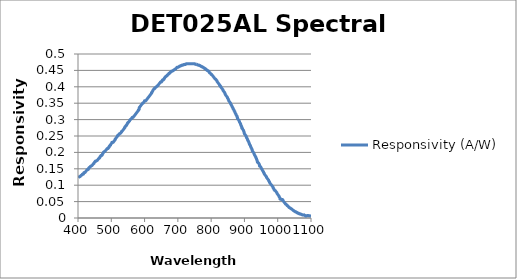
| Category | Responsivity (A/W) |
|---|---|
| 400.30475 | 0.123 |
| 401.60951 | 0.125 |
| 403.91426 | 0.125 |
| 405.21901 | 0.127 |
| 406.52377 | 0.127 |
| 407.82852 | 0.128 |
| 409.13327 | 0.13 |
| 410.43802 | 0.13 |
| 411.74278 | 0.132 |
| 413.04753 | 0.133 |
| 414.35228 | 0.133 |
| 415.65704 | 0.133 |
| 416.96179 | 0.135 |
| 416.96179 | 0.137 |
| 418.26654 | 0.137 |
| 418.26654 | 0.139 |
| 419.5713 | 0.139 |
| 420.87605 | 0.139 |
| 422.1808 | 0.14 |
| 423.48555 | 0.142 |
| 424.79031 | 0.144 |
| 426.09506 | 0.146 |
| 427.39981 | 0.147 |
| 428.70457 | 0.147 |
| 430.00932 | 0.147 |
| 431.31407 | 0.149 |
| 431.31407 | 0.151 |
| 432.61883 | 0.151 |
| 432.61883 | 0.153 |
| 433.92358 | 0.154 |
| 435.22833 | 0.154 |
| 436.53308 | 0.156 |
| 437.83784 | 0.158 |
| 439.14259 | 0.158 |
| 440.44734 | 0.16 |
| 441.7521 | 0.16 |
| 443.05685 | 0.161 |
| 444.3616 | 0.163 |
| 445.66636 | 0.165 |
| 446.97111 | 0.166 |
| 448.27586 | 0.166 |
| 448.27586 | 0.168 |
| 449.58062 | 0.17 |
| 450.88537 | 0.172 |
| 452.19012 | 0.173 |
| 453.49487 | 0.173 |
| 454.79963 | 0.173 |
| 456.10438 | 0.175 |
| 457.40913 | 0.175 |
| 458.71389 | 0.177 |
| 460.01864 | 0.179 |
| 461.32339 | 0.18 |
| 462.62815 | 0.182 |
| 463.9329 | 0.182 |
| 465.23765 | 0.184 |
| 465.23765 | 0.186 |
| 466.5424 | 0.186 |
| 466.5424 | 0.187 |
| 467.84716 | 0.189 |
| 469.15191 | 0.191 |
| 470.45666 | 0.191 |
| 471.76142 | 0.191 |
| 473.06617 | 0.192 |
| 473.06617 | 0.194 |
| 474.37092 | 0.196 |
| 475.67568 | 0.198 |
| 475.67568 | 0.199 |
| 476.98043 | 0.201 |
| 478.28518 | 0.201 |
| 479.58993 | 0.203 |
| 480.89469 | 0.203 |
| 482.19944 | 0.205 |
| 483.50419 | 0.206 |
| 484.80895 | 0.208 |
| 486.1137 | 0.21 |
| 487.41845 | 0.212 |
| 488.72321 | 0.212 |
| 490.02796 | 0.212 |
| 491.33271 | 0.213 |
| 492.63747 | 0.215 |
| 492.63747 | 0.217 |
| 493.94222 | 0.217 |
| 493.94222 | 0.218 |
| 495.24697 | 0.22 |
| 496.55172 | 0.222 |
| 497.85648 | 0.222 |
| 497.85648 | 0.224 |
| 499.16123 | 0.225 |
| 500.46598 | 0.227 |
| 501.77074 | 0.229 |
| 501.77074 | 0.231 |
| 503.07549 | 0.231 |
| 504.38024 | 0.231 |
| 505.685 | 0.231 |
| 506.98975 | 0.232 |
| 508.2945 | 0.234 |
| 509.59925 | 0.236 |
| 510.90401 | 0.238 |
| 510.90401 | 0.239 |
| 512.20876 | 0.239 |
| 512.20876 | 0.241 |
| 513.51351 | 0.243 |
| 514.81827 | 0.245 |
| 516.12302 | 0.246 |
| 517.42777 | 0.248 |
| 518.73253 | 0.25 |
| 518.73253 | 0.251 |
| 520.03728 | 0.251 |
| 521.34203 | 0.253 |
| 522.64678 | 0.255 |
| 523.95154 | 0.255 |
| 523.95154 | 0.257 |
| 525.25629 | 0.257 |
| 526.56104 | 0.258 |
| 527.8658 | 0.258 |
| 529.17055 | 0.26 |
| 530.4753 | 0.262 |
| 530.4753 | 0.264 |
| 531.78006 | 0.264 |
| 533.08481 | 0.265 |
| 534.38956 | 0.267 |
| 535.69431 | 0.269 |
| 536.99907 | 0.271 |
| 538.30382 | 0.272 |
| 539.60857 | 0.274 |
| 539.60857 | 0.276 |
| 540.91333 | 0.276 |
| 540.91333 | 0.277 |
| 542.21808 | 0.279 |
| 543.52283 | 0.281 |
| 544.82759 | 0.281 |
| 544.82759 | 0.283 |
| 546.13234 | 0.283 |
| 546.13234 | 0.284 |
| 547.43709 | 0.286 |
| 548.74185 | 0.288 |
| 548.74185 | 0.29 |
| 550.0466 | 0.291 |
| 551.35135 | 0.291 |
| 552.6561 | 0.293 |
| 553.96086 | 0.295 |
| 555.26561 | 0.297 |
| 555.26561 | 0.298 |
| 556.57036 | 0.3 |
| 557.87512 | 0.3 |
| 559.17987 | 0.302 |
| 560.48462 | 0.303 |
| 561.78938 | 0.303 |
| 561.78938 | 0.305 |
| 563.09413 | 0.305 |
| 563.09413 | 0.307 |
| 564.39888 | 0.307 |
| 565.70363 | 0.307 |
| 567.00839 | 0.309 |
| 568.31314 | 0.31 |
| 569.61789 | 0.312 |
| 570.92265 | 0.314 |
| 572.2274 | 0.316 |
| 573.53215 | 0.317 |
| 574.83691 | 0.319 |
| 576.14166 | 0.321 |
| 577.44641 | 0.323 |
| 578.75116 | 0.324 |
| 580.05592 | 0.326 |
| 581.36067 | 0.328 |
| 581.36067 | 0.33 |
| 582.66542 | 0.33 |
| 582.66542 | 0.331 |
| 583.97018 | 0.331 |
| 583.97018 | 0.333 |
| 583.97018 | 0.335 |
| 583.97018 | 0.336 |
| 585.27493 | 0.338 |
| 586.57968 | 0.34 |
| 587.88444 | 0.342 |
| 589.18919 | 0.343 |
| 590.49394 | 0.345 |
| 591.7987 | 0.347 |
| 593.10345 | 0.349 |
| 594.4082 | 0.35 |
| 595.71295 | 0.35 |
| 597.01771 | 0.352 |
| 598.32246 | 0.354 |
| 599.62721 | 0.356 |
| 599.62721 | 0.357 |
| 600.93197 | 0.357 |
| 602.23672 | 0.357 |
| 603.54147 | 0.357 |
| 604.84623 | 0.359 |
| 606.15098 | 0.361 |
| 607.45573 | 0.362 |
| 608.76048 | 0.364 |
| 610.06524 | 0.366 |
| 611.36999 | 0.368 |
| 612.67474 | 0.369 |
| 613.9795 | 0.371 |
| 615.28425 | 0.373 |
| 616.589 | 0.375 |
| 617.89376 | 0.376 |
| 619.19851 | 0.378 |
| 620.50326 | 0.38 |
| 620.50326 | 0.382 |
| 621.80801 | 0.382 |
| 621.80801 | 0.383 |
| 623.11277 | 0.385 |
| 624.41752 | 0.387 |
| 624.41752 | 0.388 |
| 625.72227 | 0.39 |
| 627.02703 | 0.392 |
| 628.33178 | 0.394 |
| 629.63653 | 0.394 |
| 629.63653 | 0.395 |
| 630.94129 | 0.395 |
| 632.24604 | 0.397 |
| 633.55079 | 0.399 |
| 634.85555 | 0.399 |
| 636.1603 | 0.401 |
| 637.46505 | 0.402 |
| 638.7698 | 0.402 |
| 640.07456 | 0.404 |
| 641.37931 | 0.406 |
| 642.68406 | 0.408 |
| 643.98882 | 0.409 |
| 645.29357 | 0.411 |
| 646.59832 | 0.413 |
| 647.90308 | 0.415 |
| 649.20783 | 0.415 |
| 650.51258 | 0.415 |
| 651.81733 | 0.416 |
| 651.81733 | 0.418 |
| 653.12209 | 0.418 |
| 653.12209 | 0.42 |
| 654.42684 | 0.421 |
| 655.73159 | 0.421 |
| 657.03635 | 0.421 |
| 658.3411 | 0.423 |
| 658.3411 | 0.425 |
| 659.64585 | 0.425 |
| 659.64585 | 0.427 |
| 660.95061 | 0.428 |
| 662.25536 | 0.43 |
| 663.56011 | 0.43 |
| 663.56011 | 0.432 |
| 664.86486 | 0.432 |
| 666.16962 | 0.434 |
| 667.47437 | 0.434 |
| 667.47437 | 0.435 |
| 668.77912 | 0.435 |
| 670.08388 | 0.437 |
| 671.38863 | 0.439 |
| 672.69338 | 0.439 |
| 672.69338 | 0.441 |
| 673.99814 | 0.441 |
| 675.30289 | 0.442 |
| 676.60764 | 0.442 |
| 676.60764 | 0.444 |
| 677.9124 | 0.444 |
| 679.21715 | 0.446 |
| 680.5219 | 0.447 |
| 681.82665 | 0.447 |
| 683.13141 | 0.447 |
| 684.43616 | 0.449 |
| 685.74091 | 0.449 |
| 687.04567 | 0.451 |
| 688.35042 | 0.451 |
| 689.65517 | 0.453 |
| 690.95993 | 0.453 |
| 692.26468 | 0.454 |
| 693.56943 | 0.454 |
| 694.87418 | 0.456 |
| 696.17894 | 0.458 |
| 697.48369 | 0.46 |
| 698.78844 | 0.46 |
| 700.0932 | 0.46 |
| 701.39795 | 0.46 |
| 702.7027 | 0.461 |
| 704.00746 | 0.461 |
| 705.31221 | 0.463 |
| 706.61696 | 0.463 |
| 707.92171 | 0.463 |
| 709.22647 | 0.465 |
| 710.53122 | 0.465 |
| 711.83597 | 0.465 |
| 713.14073 | 0.467 |
| 714.44548 | 0.467 |
| 715.75023 | 0.467 |
| 717.05499 | 0.467 |
| 718.35974 | 0.468 |
| 719.66449 | 0.468 |
| 720.96925 | 0.468 |
| 722.274 | 0.468 |
| 723.57875 | 0.468 |
| 724.8835 | 0.47 |
| 726.18826 | 0.47 |
| 727.49301 | 0.47 |
| 728.79776 | 0.47 |
| 730.10252 | 0.47 |
| 731.40727 | 0.47 |
| 732.71202 | 0.47 |
| 734.01678 | 0.47 |
| 735.32153 | 0.47 |
| 736.62628 | 0.47 |
| 737.93103 | 0.47 |
| 739.23579 | 0.47 |
| 740.54054 | 0.47 |
| 741.84529 | 0.47 |
| 743.15005 | 0.47 |
| 744.4548 | 0.47 |
| 745.75955 | 0.47 |
| 747.06431 | 0.47 |
| 748.36906 | 0.47 |
| 749.67381 | 0.47 |
| 750.97856 | 0.47 |
| 752.28332 | 0.468 |
| 753.58807 | 0.468 |
| 754.89282 | 0.468 |
| 756.19758 | 0.468 |
| 757.50233 | 0.468 |
| 758.80708 | 0.467 |
| 760.11184 | 0.467 |
| 761.41659 | 0.467 |
| 762.72134 | 0.467 |
| 764.0261 | 0.465 |
| 765.33085 | 0.465 |
| 766.6356 | 0.465 |
| 767.94035 | 0.463 |
| 769.24511 | 0.463 |
| 770.54986 | 0.461 |
| 771.85461 | 0.461 |
| 773.15937 | 0.461 |
| 774.46412 | 0.46 |
| 775.76887 | 0.46 |
| 777.07363 | 0.458 |
| 778.37838 | 0.458 |
| 779.68313 | 0.456 |
| 780.98788 | 0.456 |
| 782.29264 | 0.455 |
| 783.59739 | 0.455 |
| 784.90214 | 0.453 |
| 786.2069 | 0.451 |
| 787.51165 | 0.451 |
| 788.8164 | 0.449 |
| 790.12116 | 0.449 |
| 791.42591 | 0.448 |
| 792.73066 | 0.448 |
| 794.03541 | 0.446 |
| 794.03541 | 0.444 |
| 795.34017 | 0.442 |
| 796.64492 | 0.442 |
| 797.94967 | 0.441 |
| 799.25443 | 0.439 |
| 800.55918 | 0.437 |
| 801.86393 | 0.437 |
| 803.16869 | 0.436 |
| 804.47344 | 0.434 |
| 805.77819 | 0.432 |
| 807.08295 | 0.43 |
| 808.3877 | 0.429 |
| 809.69245 | 0.427 |
| 810.9972 | 0.425 |
| 812.30196 | 0.423 |
| 813.60671 | 0.423 |
| 814.91146 | 0.422 |
| 816.21622 | 0.42 |
| 817.52097 | 0.418 |
| 817.52097 | 0.416 |
| 818.82572 | 0.415 |
| 820.13048 | 0.413 |
| 821.43523 | 0.411 |
| 822.73998 | 0.41 |
| 824.04473 | 0.408 |
| 825.34949 | 0.406 |
| 825.34949 | 0.404 |
| 826.65424 | 0.404 |
| 826.65424 | 0.403 |
| 827.95899 | 0.403 |
| 827.95899 | 0.401 |
| 829.26375 | 0.401 |
| 829.26375 | 0.399 |
| 830.5685 | 0.397 |
| 831.87325 | 0.396 |
| 833.17801 | 0.394 |
| 834.48276 | 0.392 |
| 835.78751 | 0.39 |
| 835.78751 | 0.389 |
| 837.09226 | 0.387 |
| 838.39702 | 0.385 |
| 839.70177 | 0.384 |
| 841.00652 | 0.382 |
| 841.00652 | 0.38 |
| 842.31128 | 0.378 |
| 842.31128 | 0.377 |
| 843.61603 | 0.375 |
| 844.92078 | 0.373 |
| 846.22554 | 0.371 |
| 847.53029 | 0.37 |
| 848.83504 | 0.368 |
| 848.83504 | 0.366 |
| 850.13979 | 0.365 |
| 851.44455 | 0.363 |
| 851.44455 | 0.361 |
| 852.7493 | 0.359 |
| 852.7493 | 0.358 |
| 854.05405 | 0.356 |
| 855.35881 | 0.354 |
| 856.66356 | 0.352 |
| 857.96831 | 0.351 |
| 857.96831 | 0.349 |
| 859.27307 | 0.347 |
| 860.57782 | 0.345 |
| 860.57782 | 0.344 |
| 861.88257 | 0.342 |
| 863.18733 | 0.34 |
| 863.18733 | 0.339 |
| 864.49208 | 0.337 |
| 865.79683 | 0.335 |
| 865.79683 | 0.333 |
| 867.10158 | 0.332 |
| 868.40634 | 0.33 |
| 868.40634 | 0.328 |
| 869.71109 | 0.326 |
| 871.01584 | 0.325 |
| 871.01584 | 0.323 |
| 872.3206 | 0.321 |
| 872.3206 | 0.319 |
| 873.62535 | 0.318 |
| 874.9301 | 0.316 |
| 874.9301 | 0.314 |
| 876.23486 | 0.313 |
| 877.53961 | 0.311 |
| 877.53961 | 0.309 |
| 878.84436 | 0.307 |
| 878.84436 | 0.306 |
| 878.84436 | 0.304 |
| 880.14911 | 0.302 |
| 881.45387 | 0.3 |
| 882.75862 | 0.299 |
| 884.06337 | 0.297 |
| 884.06337 | 0.295 |
| 885.36813 | 0.294 |
| 885.36813 | 0.292 |
| 886.67288 | 0.29 |
| 887.97763 | 0.288 |
| 887.97763 | 0.287 |
| 889.28239 | 0.285 |
| 889.28239 | 0.283 |
| 890.58714 | 0.281 |
| 890.58714 | 0.28 |
| 891.89189 | 0.278 |
| 891.89189 | 0.276 |
| 891.89189 | 0.274 |
| 893.19664 | 0.273 |
| 894.5014 | 0.273 |
| 894.5014 | 0.271 |
| 895.80615 | 0.269 |
| 897.1109 | 0.268 |
| 897.1109 | 0.266 |
| 898.41566 | 0.264 |
| 898.41566 | 0.262 |
| 899.72041 | 0.261 |
| 899.72041 | 0.259 |
| 899.72041 | 0.257 |
| 901.02516 | 0.255 |
| 902.32992 | 0.254 |
| 903.63467 | 0.252 |
| 904.93942 | 0.25 |
| 904.93942 | 0.248 |
| 906.24418 | 0.247 |
| 906.24418 | 0.245 |
| 907.54893 | 0.243 |
| 908.85368 | 0.242 |
| 908.85368 | 0.24 |
| 910.15843 | 0.238 |
| 910.15843 | 0.236 |
| 911.46319 | 0.235 |
| 912.76794 | 0.233 |
| 912.76794 | 0.231 |
| 914.07269 | 0.229 |
| 914.07269 | 0.228 |
| 915.37745 | 0.226 |
| 915.37745 | 0.224 |
| 916.6822 | 0.222 |
| 917.98695 | 0.221 |
| 917.98695 | 0.219 |
| 919.29171 | 0.217 |
| 919.29171 | 0.216 |
| 920.59646 | 0.214 |
| 921.90121 | 0.212 |
| 921.90121 | 0.21 |
| 923.20596 | 0.209 |
| 923.20596 | 0.207 |
| 923.20596 | 0.205 |
| 924.51072 | 0.203 |
| 925.81547 | 0.202 |
| 927.12022 | 0.2 |
| 928.42498 | 0.198 |
| 928.42498 | 0.196 |
| 929.72973 | 0.195 |
| 929.72973 | 0.193 |
| 931.03448 | 0.191 |
| 932.33924 | 0.19 |
| 932.33924 | 0.188 |
| 933.64399 | 0.186 |
| 934.94874 | 0.184 |
| 934.94874 | 0.183 |
| 936.25349 | 0.181 |
| 936.25349 | 0.179 |
| 937.55825 | 0.177 |
| 937.55825 | 0.176 |
| 938.863 | 0.174 |
| 938.863 | 0.172 |
| 938.863 | 0.171 |
| 940.16775 | 0.169 |
| 941.47251 | 0.169 |
| 942.77726 | 0.167 |
| 944.08201 | 0.165 |
| 944.08201 | 0.164 |
| 945.38677 | 0.162 |
| 945.38677 | 0.16 |
| 945.38677 | 0.158 |
| 946.69152 | 0.158 |
| 947.99627 | 0.157 |
| 949.30103 | 0.155 |
| 950.60578 | 0.153 |
| 950.60578 | 0.151 |
| 951.91053 | 0.15 |
| 953.21528 | 0.148 |
| 953.21528 | 0.146 |
| 954.52004 | 0.145 |
| 955.82479 | 0.143 |
| 957.12954 | 0.141 |
| 957.12954 | 0.139 |
| 958.4343 | 0.138 |
| 959.73905 | 0.136 |
| 959.73905 | 0.134 |
| 961.0438 | 0.132 |
| 962.34856 | 0.131 |
| 963.65331 | 0.129 |
| 964.95806 | 0.127 |
| 966.26281 | 0.125 |
| 966.26281 | 0.124 |
| 967.56757 | 0.122 |
| 968.87232 | 0.12 |
| 970.17707 | 0.119 |
| 971.48183 | 0.117 |
| 972.78658 | 0.115 |
| 972.78658 | 0.113 |
| 974.09133 | 0.112 |
| 975.39609 | 0.11 |
| 975.39609 | 0.108 |
| 976.70084 | 0.106 |
| 978.00559 | 0.105 |
| 979.31034 | 0.103 |
| 980.6151 | 0.101 |
| 981.91985 | 0.1 |
| 983.2246 | 0.098 |
| 984.52936 | 0.096 |
| 985.83411 | 0.094 |
| 985.83411 | 0.093 |
| 987.13886 | 0.091 |
| 988.44362 | 0.089 |
| 988.44362 | 0.087 |
| 989.74837 | 0.086 |
| 991.05312 | 0.084 |
| 992.35788 | 0.084 |
| 993.66263 | 0.082 |
| 994.96738 | 0.08 |
| 996.27213 | 0.079 |
| 997.57689 | 0.077 |
| 997.57689 | 0.075 |
| 998.88164 | 0.074 |
| 1000.18639 | 0.072 |
| 1001.49115 | 0.07 |
| 1002.7959 | 0.068 |
| 1004.10065 | 0.067 |
| 1004.10065 | 0.065 |
| 1005.40541 | 0.063 |
| 1006.71016 | 0.061 |
| 1006.71016 | 0.06 |
| 1006.71016 | 0.058 |
| 1008.01491 | 0.058 |
| 1009.31966 | 0.058 |
| 1010.62442 | 0.056 |
| 1011.92917 | 0.056 |
| 1013.23392 | 0.056 |
| 1014.53868 | 0.056 |
| 1015.84343 | 0.054 |
| 1015.84343 | 0.053 |
| 1017.14818 | 0.051 |
| 1018.45294 | 0.049 |
| 1019.75769 | 0.048 |
| 1021.06244 | 0.046 |
| 1022.36719 | 0.044 |
| 1023.67195 | 0.042 |
| 1024.9767 | 0.042 |
| 1026.28145 | 0.041 |
| 1027.58621 | 0.039 |
| 1028.89096 | 0.037 |
| 1030.19571 | 0.037 |
| 1031.50047 | 0.035 |
| 1032.80522 | 0.034 |
| 1034.10997 | 0.032 |
| 1035.41473 | 0.032 |
| 1036.71948 | 0.03 |
| 1038.02423 | 0.03 |
| 1039.32898 | 0.029 |
| 1040.63374 | 0.029 |
| 1041.93849 | 0.027 |
| 1043.24324 | 0.027 |
| 1044.548 | 0.025 |
| 1045.85275 | 0.023 |
| 1047.1575 | 0.023 |
| 1048.46226 | 0.022 |
| 1049.76701 | 0.022 |
| 1051.07176 | 0.02 |
| 1052.37651 | 0.02 |
| 1053.68127 | 0.018 |
| 1054.98602 | 0.018 |
| 1056.29077 | 0.018 |
| 1057.59553 | 0.016 |
| 1058.90028 | 0.016 |
| 1060.20503 | 0.015 |
| 1061.50979 | 0.015 |
| 1062.81454 | 0.015 |
| 1064.11929 | 0.013 |
| 1065.42404 | 0.013 |
| 1066.7288 | 0.013 |
| 1068.03355 | 0.011 |
| 1069.3383 | 0.011 |
| 1070.64306 | 0.011 |
| 1071.94781 | 0.011 |
| 1073.25256 | 0.01 |
| 1074.55732 | 0.01 |
| 1075.86207 | 0.01 |
| 1077.16682 | 0.01 |
| 1078.47158 | 0.01 |
| 1079.77633 | 0.01 |
| 1081.08108 | 0.008 |
| 1082.38583 | 0.008 |
| 1083.69059 | 0.006 |
| 1084.99534 | 0.006 |
| 1090.0 | 0.008 |
| 1100.0 | 0.006 |